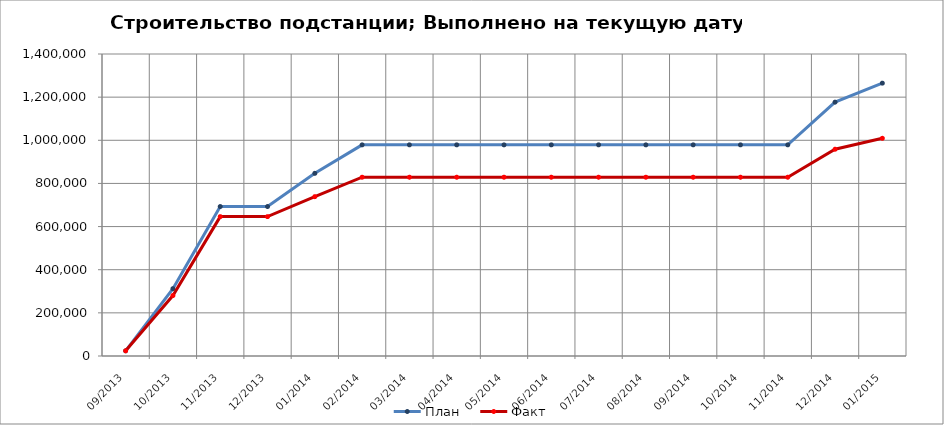
| Category | План | Факт |
|---|---|---|
| 2013-09-01 | 24000 | 24000 |
| 2013-10-01 | 312000 | 280320 |
| 2013-11-01 | 692822 | 646151 |
| 2013-12-01 | 692822 | 646151 |
| 2014-01-01 | 846822 | 738551 |
| 2014-02-01 | 978822 | 828751 |
| 2014-03-01 | 978822 | 828751 |
| 2014-04-01 | 978822 | 828751 |
| 2014-05-01 | 978822 | 828751 |
| 2014-06-01 | 978822 | 828751 |
| 2014-07-01 | 978822 | 828751 |
| 2014-08-01 | 978822 | 828751 |
| 2014-09-01 | 978822 | 828751 |
| 2014-10-01 | 978822 | 828751 |
| 2014-11-01 | 978822 | 828751 |
| 2014-12-01 | 1176822 | 958551 |
| 2015-01-01 | 1264822 | 1009151 |